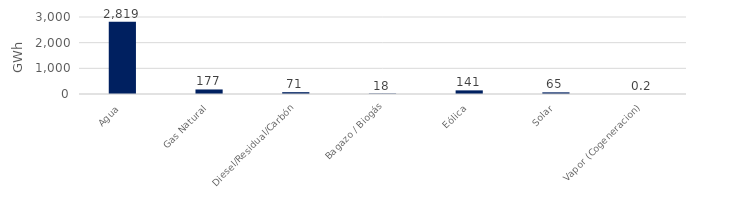
| Category | Series 0 |
|---|---|
| Agua | 2818.875 |
| Gas Natural | 176.843 |
| Diesel/Residual/Carbón | 71.226 |
| Bagazo / Biogás | 17.844 |
| Eólica | 141.381 |
| Solar | 64.588 |
| Vapor (Cogeneracion) | 0.15 |